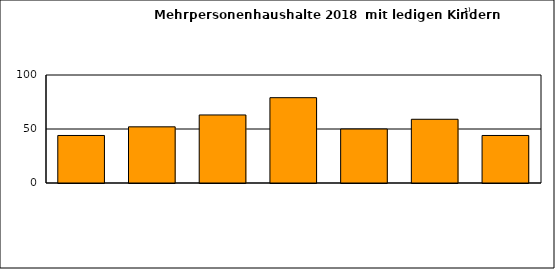
| Category | Series 0 |
|---|---|
| 0 | 44 |
| 1 | 52 |
| 2 | 63 |
| 3 | 79 |
| 4 | 50 |
| 5 | 59 |
| 6 | 44 |